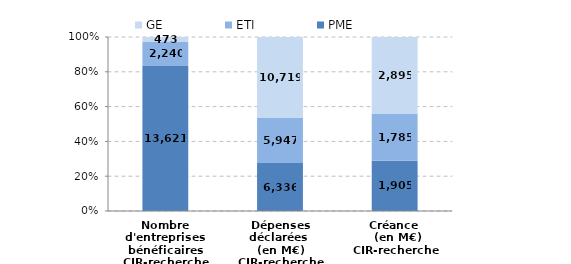
| Category | PME | ETI | GE |
|---|---|---|---|
| Nombre d'entreprises bénéficaires
CIR-recherche | 13621 | 2240 | 473 |
| Dépenses déclarées 
(en M€)
CIR-recherche | 6335.61 | 5947.4 | 10718.72 |
| Créance 
 (en M€)
CIR-recherche | 1904.9 | 1785.46 | 2895 |